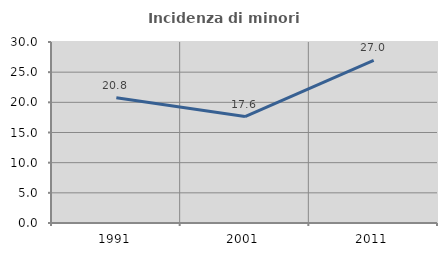
| Category | Incidenza di minori stranieri |
|---|---|
| 1991.0 | 20.755 |
| 2001.0 | 17.647 |
| 2011.0 | 26.953 |